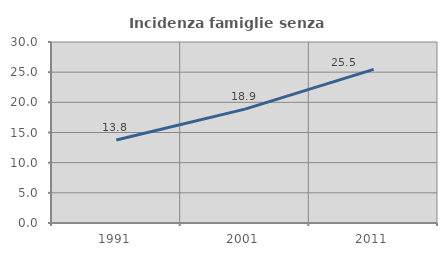
| Category | Incidenza famiglie senza nuclei |
|---|---|
| 1991.0 | 13.757 |
| 2001.0 | 18.868 |
| 2011.0 | 25.462 |